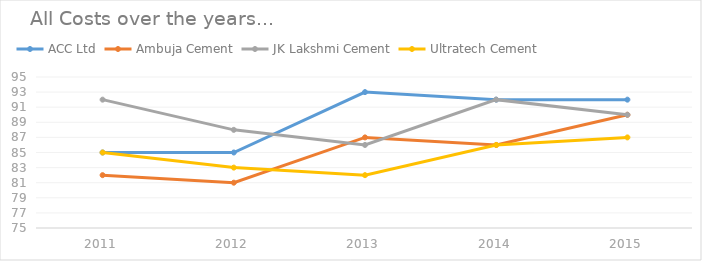
| Category | ACC Ltd | Ambuja Cement | JK Lakshmi Cement | Ultratech Cement |
|---|---|---|---|---|
| 2011 | 85 | 82 | 92 | 85 |
| 2012 | 85 | 81 | 88 | 83 |
| 2013 | 93 | 87 | 86 | 82 |
| 2014 | 92 | 86 | 92 | 86 |
| 2015 | 92 | 90 | 90 | 87 |